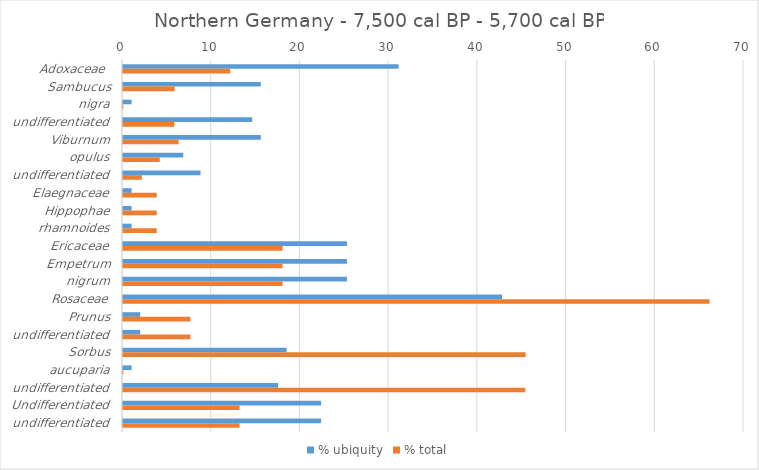
| Category | % ubiquity | % total |
|---|---|---|
| Adoxaceae  | 31.068 | 12.084 |
| Sambucus | 15.534 | 5.819 |
| nigra | 0.971 | 0.035 |
| undifferentiated | 14.563 | 5.784 |
| Viburnum | 15.534 | 6.265 |
| opulus | 6.796 | 4.141 |
| undifferentiated | 8.738 | 2.124 |
| Elaegnaceae | 0.971 | 3.804 |
| Hippophae | 0.971 | 3.804 |
| rhamnoides | 0.971 | 3.804 |
| Ericaceae | 25.243 | 17.987 |
| Empetrum | 25.243 | 17.987 |
| nigrum | 25.243 | 17.987 |
| Rosaceae | 42.718 | 66.125 |
| Prunus | 1.942 | 7.601 |
| undifferentiated | 1.942 | 7.601 |
| Sorbus | 18.447 | 45.385 |
| aucuparia | 0.971 | 0.038 |
| undifferentiated | 17.476 | 45.347 |
| Undifferentiated | 22.33 | 13.138 |
| undifferentiated | 22.33 | 13.138 |